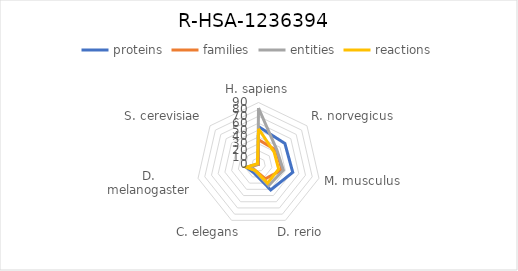
| Category | proteins | families | entities | reactions |
|---|---|---|---|---|
| H. sapiens | 55 | 36 | 82 | 52 |
| R. norvegicus | 49 | 33 | 34 | 29 |
| M. musculus | 51 | 35 | 37 | 30 |
| D. rerio | 41 | 23 | 34 | 30 |
| C. elegans | 14 | 10 | 11 | 10 |
| D. melanogaster | 18 | 11 | 12 | 18 |
| S. cerevisiae | 1 | 0 | 1 | 2 |